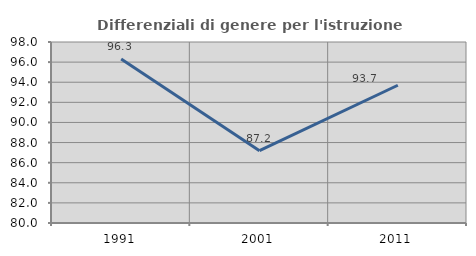
| Category | Differenziali di genere per l'istruzione superiore |
|---|---|
| 1991.0 | 96.307 |
| 2001.0 | 87.187 |
| 2011.0 | 93.7 |